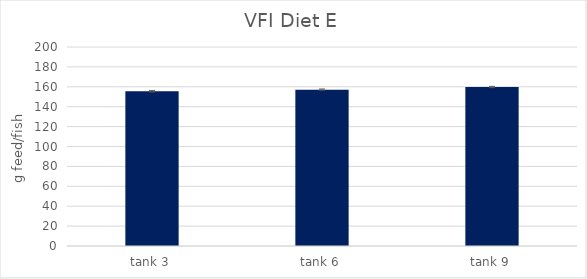
| Category | Diet E |
|---|---|
| tank 3 | 155.547 |
| tank 6 | 157.148 |
| tank 9 | 159.806 |